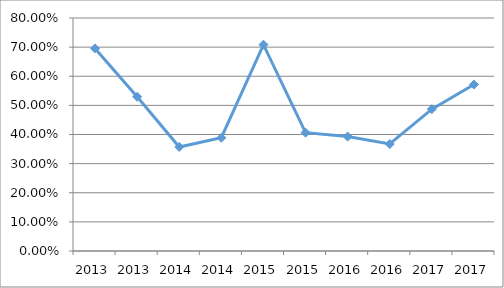
| Category | PRO1-I2O23 |
|---|---|
| 2013.0 | 0.696 |
| 2013.0 | 0.529 |
| 2014.0 | 0.357 |
| 2014.0 | 0.389 |
| 2015.0 | 0.708 |
| 2015.0 | 0.406 |
| 2016.0 | 0.393 |
| 2016.0 | 0.367 |
| 2017.0 | 0.487 |
| 2017.0 | 0.571 |